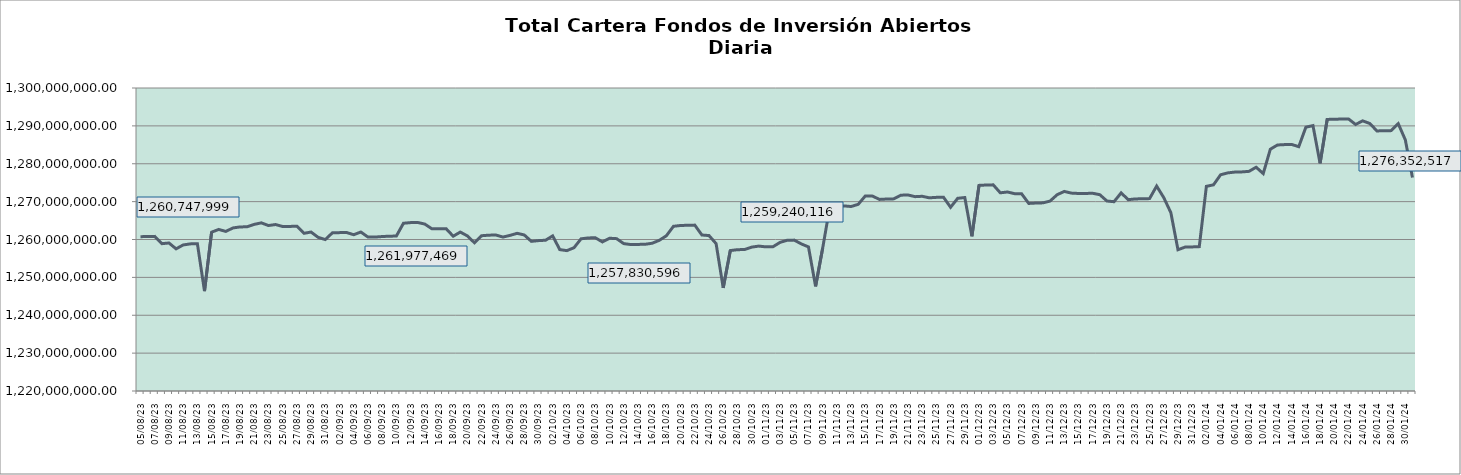
| Category | Cartera |
|---|---|
| 2023-08-05 | 1260747998.532 |
| 2023-08-06 | 1260785686.865 |
| 2023-08-07 | 1260823019.667 |
| 2023-08-08 | 1258898440.18 |
| 2023-08-09 | 1259078678.365 |
| 2023-08-10 | 1257534159.085 |
| 2023-08-11 | 1258560854.339 |
| 2023-08-12 | 1258842546.345 |
| 2023-08-13 | 1258882564.185 |
| 2023-08-14 | 1246358084.6 |
| 2023-08-15 | 1261935537.026 |
| 2023-08-16 | 1262655010.997 |
| 2023-08-17 | 1262132409.804 |
| 2023-08-18 | 1263049335.56 |
| 2023-08-19 | 1263315900.867 |
| 2023-08-20 | 1263355570.235 |
| 2023-08-21 | 1263994836.004 |
| 2023-08-22 | 1264393042.57 |
| 2023-08-23 | 1263690266.072 |
| 2023-08-24 | 1263952412.588 |
| 2023-08-25 | 1263429838.401 |
| 2023-08-26 | 1263453627.542 |
| 2023-08-27 | 1263503921.778 |
| 2023-08-28 | 1261628485.84 |
| 2023-08-29 | 1261969772.257 |
| 2023-08-30 | 1260563311.485 |
| 2023-08-31 | 1259983580.661 |
| 2023-09-01 | 1261764303.336 |
| 2023-09-02 | 1261815055.863 |
| 2023-09-03 | 1261842352.387 |
| 2023-09-04 | 1261262553.074 |
| 2023-09-05 | 1261977468.827 |
| 2023-09-06 | 1260651196.5 |
| 2023-09-07 | 1260641819.512 |
| 2023-09-08 | 1260782235.424 |
| 2023-09-09 | 1260870541.525 |
| 2023-09-10 | 1260910795.722 |
| 2023-09-11 | 1264289778.055 |
| 2023-09-12 | 1264460849.449 |
| 2023-09-13 | 1264500598.172 |
| 2023-09-14 | 1264072639.291 |
| 2023-09-15 | 1262825024.194 |
| 2023-09-16 | 1262817051.534 |
| 2023-09-17 | 1262859307.795 |
| 2023-09-18 | 1260867478.806 |
| 2023-09-19 | 1261961493.782 |
| 2023-09-20 | 1260946690.099 |
| 2023-09-21 | 1259114763.207 |
| 2023-09-22 | 1260997098.899 |
| 2023-09-23 | 1261141736.23 |
| 2023-09-24 | 1261189713.987 |
| 2023-09-25 | 1260642758.497 |
| 2023-09-26 | 1261085731.831 |
| 2023-09-27 | 1261634417.556 |
| 2023-09-28 | 1261201279.699 |
| 2023-09-29 | 1259511385.257 |
| 2023-09-30 | 1259706454.687 |
| 2023-10-01 | 1259806949.306 |
| 2023-10-02 | 1260957935.685 |
| 2023-10-03 | 1257325107.507 |
| 2023-10-04 | 1257064565.795 |
| 2023-10-05 | 1257830595.669 |
| 2023-10-06 | 1260184127.747 |
| 2023-10-07 | 1260415527.42 |
| 2023-10-08 | 1260461345.178 |
| 2023-10-09 | 1259358234.131 |
| 2023-10-10 | 1260332972.786 |
| 2023-10-11 | 1260222664.916 |
| 2023-10-12 | 1258912387.356 |
| 2023-10-13 | 1258666776.469 |
| 2023-10-14 | 1258705305.112 |
| 2023-10-15 | 1258735230.007 |
| 2023-10-16 | 1259011773.971 |
| 2023-10-17 | 1259780441.553 |
| 2023-10-18 | 1260979208.568 |
| 2023-10-19 | 1263484715.095 |
| 2023-10-20 | 1263698552.549 |
| 2023-10-21 | 1263757481.521 |
| 2023-10-22 | 1263798068.292 |
| 2023-10-23 | 1261187586.187 |
| 2023-10-24 | 1261039074.702 |
| 2023-10-25 | 1258908871.796 |
| 2023-10-26 | 1247223658.025 |
| 2023-10-27 | 1257076904.646 |
| 2023-10-28 | 1257310110.149 |
| 2023-10-29 | 1257355345.985 |
| 2023-10-30 | 1257982426.097 |
| 2023-10-31 | 1258259699.613 |
| 2023-11-01 | 1258054263.552 |
| 2023-11-02 | 1258085556.479 |
| 2023-11-03 | 1259240115.872 |
| 2023-11-04 | 1259795785.498 |
| 2023-11-05 | 1259837356.679 |
| 2023-11-06 | 1258826687.57 |
| 2023-11-07 | 1258047320.339 |
| 2023-11-08 | 1247624171.337 |
| 2023-11-09 | 1257731505.326 |
| 2023-11-10 | 1268579461.33 |
| 2023-11-11 | 1268832111.433 |
| 2023-11-12 | 1268871062.366 |
| 2023-11-13 | 1268709027.278 |
| 2023-11-14 | 1269288004.176 |
| 2023-11-15 | 1271500248.871 |
| 2023-11-16 | 1271462511.415 |
| 2023-11-17 | 1270583173.102 |
| 2023-11-18 | 1270687097.565 |
| 2023-11-19 | 1270727762.602 |
| 2023-11-20 | 1271699664.497 |
| 2023-11-21 | 1271756277.606 |
| 2023-11-22 | 1271311697.638 |
| 2023-11-23 | 1271406659.874 |
| 2023-11-24 | 1271009593.832 |
| 2023-11-25 | 1271125450.296 |
| 2023-11-26 | 1271166398.074 |
| 2023-11-27 | 1268506228.708 |
| 2023-11-28 | 1270874469.494 |
| 2023-11-29 | 1271084761.382 |
| 2023-11-30 | 1260839043.955 |
| 2023-12-01 | 1274288438.078 |
| 2023-12-02 | 1274384348.04 |
| 2023-12-03 | 1274427487.305 |
| 2023-12-04 | 1272326805.415 |
| 2023-12-05 | 1272542829.212 |
| 2023-12-06 | 1272105173.686 |
| 2023-12-07 | 1272062588.965 |
| 2023-12-08 | 1269520094.835 |
| 2023-12-09 | 1269625494.803 |
| 2023-12-10 | 1269677347.925 |
| 2023-12-11 | 1270147553.023 |
| 2023-12-12 | 1271829872.323 |
| 2023-12-13 | 1272691594.754 |
| 2023-12-14 | 1272247294.02 |
| 2023-12-15 | 1272153174.174 |
| 2023-12-16 | 1272159983.832 |
| 2023-12-17 | 1272205137.856 |
| 2023-12-18 | 1271832844.93 |
| 2023-12-19 | 1270167007.51 |
| 2023-12-20 | 1269974534.347 |
| 2023-12-21 | 1272306546.628 |
| 2023-12-22 | 1270516760.03 |
| 2023-12-23 | 1270711194.016 |
| 2023-12-24 | 1270751635 |
| 2023-12-25 | 1270797116.2 |
| 2023-12-26 | 1274104752.528 |
| 2023-12-27 | 1271060221.024 |
| 2023-12-28 | 1267081123.62 |
| 2023-12-29 | 1257300130.86 |
| 2023-12-30 | 1257992484.404 |
| 2023-12-31 | 1258039871.33 |
| 2024-01-01 | 1258117795.206 |
| 2024-01-02 | 1274034731.137 |
| 2024-01-03 | 1274430990.188 |
| 2024-01-04 | 1277088487.36 |
| 2024-01-05 | 1277585506.593 |
| 2024-01-06 | 1277804016.938 |
| 2024-01-07 | 1277848403.178 |
| 2024-01-08 | 1277991507.812 |
| 2024-01-09 | 1279082928.704 |
| 2024-01-10 | 1277400794.566 |
| 2024-01-11 | 1283831331.726 |
| 2024-01-12 | 1284952222.519 |
| 2024-01-13 | 1285055079.085 |
| 2024-01-14 | 1285097278.986 |
| 2024-01-15 | 1284507751.376 |
| 2024-01-16 | 1289651808.49 |
| 2024-01-17 | 1290070582.418 |
| 2024-01-18 | 1280105396.061 |
| 2024-01-19 | 1291700380.736 |
| 2024-01-20 | 1291758173.458 |
| 2024-01-21 | 1291799472.422 |
| 2024-01-22 | 1291836595.88 |
| 2024-01-23 | 1290372691.378 |
| 2024-01-24 | 1291323719.3 |
| 2024-01-25 | 1290628320.493 |
| 2024-01-26 | 1288667830.982 |
| 2024-01-27 | 1288706878.222 |
| 2024-01-28 | 1288745689.995 |
| 2024-01-29 | 1290590340.989 |
| 2024-01-30 | 1286295159.804 |
| 2024-01-31 | 1276352517.239 |